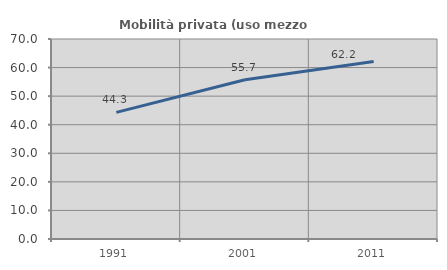
| Category | Mobilità privata (uso mezzo privato) |
|---|---|
| 1991.0 | 44.329 |
| 2001.0 | 55.72 |
| 2011.0 | 62.161 |